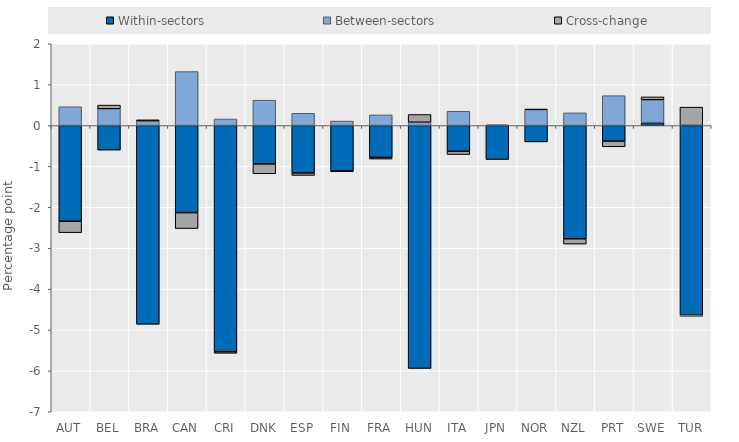
| Category | Within-sectors | Between-sectors | Cross-change |
|---|---|---|---|
| AUT | -2.34 | 0.46 | -0.28 |
| BEL | -0.6 | 0.41 | 0.09 |
| BRA | -4.86 | 0.11 | 0.03 |
| CAN | -2.13 | 1.32 | -0.39 |
| CRI | -5.53 | 0.16 | -0.04 |
| DNK | -0.94 | 0.62 | -0.24 |
| ESP | -1.16 | 0.3 | -0.06 |
| FIN | -1.11 | 0.11 | -0.02 |
| FRA | -0.78 | 0.26 | -0.04 |
| HUN | -5.94 | 0.08 | 0.19 |
| ITA | -0.63 | 0.35 | -0.08 |
| JPN | -0.83 | 0.02 | 0 |
| NOR | -0.4 | 0.39 | 0.01 |
| NZL | -2.77 | 0.31 | -0.13 |
| PRT | -0.38 | 0.73 | -0.14 |
| SWE | 0.07 | 0.56 | 0.07 |
| TUR | -4.63 | -0.04 | 0.45 |